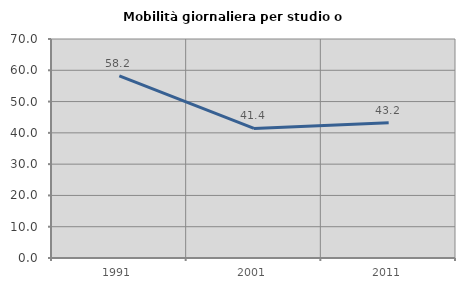
| Category | Mobilità giornaliera per studio o lavoro |
|---|---|
| 1991.0 | 58.228 |
| 2001.0 | 41.429 |
| 2011.0 | 43.243 |